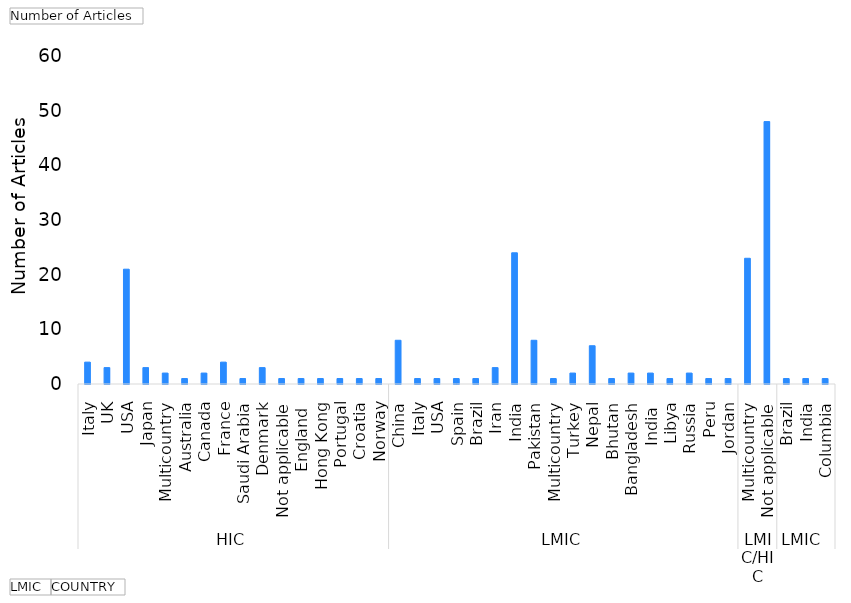
| Category | Total |
|---|---|
| 0 | 4 |
| 1 | 3 |
| 2 | 21 |
| 3 | 3 |
| 4 | 2 |
| 5 | 1 |
| 6 | 2 |
| 7 | 4 |
| 8 | 1 |
| 9 | 3 |
| 10 | 1 |
| 11 | 1 |
| 12 | 1 |
| 13 | 1 |
| 14 | 1 |
| 15 | 1 |
| 16 | 8 |
| 17 | 1 |
| 18 | 1 |
| 19 | 1 |
| 20 | 1 |
| 21 | 3 |
| 22 | 24 |
| 23 | 8 |
| 24 | 1 |
| 25 | 2 |
| 26 | 7 |
| 27 | 1 |
| 28 | 2 |
| 29 | 2 |
| 30 | 1 |
| 31 | 2 |
| 32 | 1 |
| 33 | 1 |
| 34 | 23 |
| 35 | 48 |
| 36 | 1 |
| 37 | 1 |
| 38 | 1 |